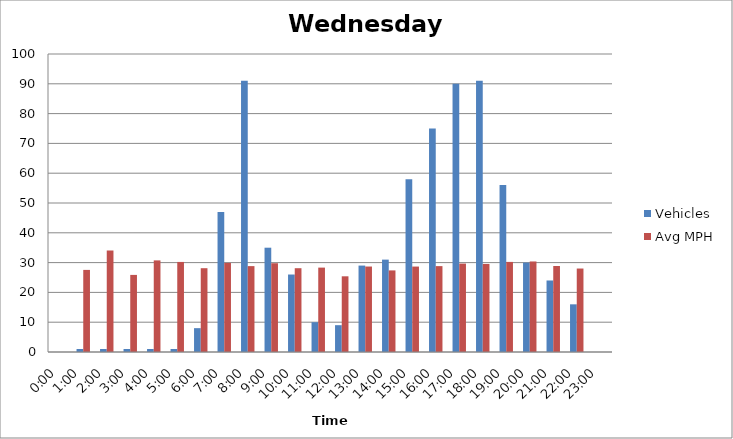
| Category | Vehicles | Avg MPH |
|---|---|---|
| 0:00 | 0 | 0 |
| 1:00 | 1 | 27.55 |
| 2:00 | 1 | 34.06 |
| 3:00 | 1 | 25.87 |
| 4:00 | 1 | 30.74 |
| 5:00 | 1 | 30.22 |
| 6:00 | 8 | 28.12 |
| 7:00 | 47 | 29.9 |
| 8:00 | 91 | 28.82 |
| 9:00 | 35 | 29.79 |
| 10:00 | 26 | 28.12 |
| 11:00 | 10 | 28.32 |
| 12:00 | 9 | 25.4 |
| 13:00 | 29 | 28.68 |
| 14:00 | 31 | 27.38 |
| 15:00 | 58 | 28.67 |
| 16:00 | 75 | 28.82 |
| 17:00 | 90 | 29.67 |
| 18:00 | 91 | 29.55 |
| 19:00 | 56 | 30.23 |
| 20:00 | 30 | 30.38 |
| 21:00 | 24 | 28.86 |
| 22:00 | 16 | 28.01 |
| 23:00 | 0 | 0 |